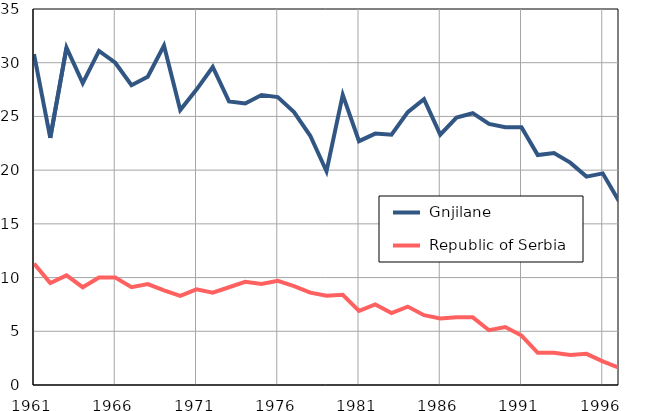
| Category |  Gnjilane |  Republic of Serbia |
|---|---|---|
| 1961.0 | 30.8 | 11.3 |
| 1962.0 | 23 | 9.5 |
| 1963.0 | 31.4 | 10.2 |
| 1964.0 | 28.1 | 9.1 |
| 1965.0 | 31.1 | 10 |
| 1966.0 | 30 | 10 |
| 1967.0 | 27.9 | 9.1 |
| 1968.0 | 28.7 | 9.4 |
| 1969.0 | 31.6 | 8.8 |
| 1970.0 | 25.6 | 8.3 |
| 1971.0 | 27.5 | 8.9 |
| 1972.0 | 29.6 | 8.6 |
| 1973.0 | 26.4 | 9.1 |
| 1974.0 | 26.2 | 9.6 |
| 1975.0 | 27 | 9.4 |
| 1976.0 | 26.8 | 9.7 |
| 1977.0 | 25.4 | 9.2 |
| 1978.0 | 23.2 | 8.6 |
| 1979.0 | 19.9 | 8.3 |
| 1980.0 | 27 | 8.4 |
| 1981.0 | 22.7 | 6.9 |
| 1982.0 | 23.4 | 7.5 |
| 1983.0 | 23.3 | 6.7 |
| 1984.0 | 25.4 | 7.3 |
| 1985.0 | 26.6 | 6.5 |
| 1986.0 | 23.3 | 6.2 |
| 1987.0 | 24.9 | 6.3 |
| 1988.0 | 25.3 | 6.3 |
| 1989.0 | 24.3 | 5.1 |
| 1990.0 | 24 | 5.4 |
| 1991.0 | 24 | 4.6 |
| 1992.0 | 21.4 | 3 |
| 1993.0 | 21.6 | 3 |
| 1994.0 | 20.7 | 2.8 |
| 1995.0 | 19.4 | 2.9 |
| 1996.0 | 19.7 | 2.2 |
| 1997.0 | 17.1 | 1.6 |